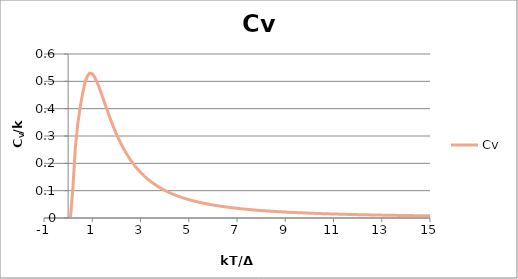
| Category | Cv |
|---|---|
| 0.1 | 0.003 |
| 0.2 | 0.111 |
| 0.3 | 0.258 |
| 0.4 | 0.345 |
| 0.5 | 0.405 |
| 0.6 | 0.456 |
| 0.7 | 0.495 |
| 0.8 | 0.52 |
| 0.9 | 0.53 |
| 1.0 | 0.528 |
| 1.1 | 0.516 |
| 1.2 | 0.497 |
| 1.3 | 0.475 |
| 1.4 | 0.45 |
| 1.5 | 0.424 |
| 1.6 | 0.399 |
| 1.7 | 0.374 |
| 1.8 | 0.351 |
| 1.9 | 0.328 |
| 2.0 | 0.308 |
| 2.1 | 0.288 |
| 2.2 | 0.27 |
| 2.3 | 0.253 |
| 2.4 | 0.238 |
| 2.5 | 0.224 |
| 2.6 | 0.211 |
| 2.7 | 0.198 |
| 2.8 | 0.187 |
| 2.9 | 0.177 |
| 3.0 | 0.167 |
| 3.1 | 0.158 |
| 3.2 | 0.15 |
| 3.3 | 0.142 |
| 3.4 | 0.135 |
| 3.5 | 0.129 |
| 3.6 | 0.122 |
| 3.7 | 0.117 |
| 3.8 | 0.111 |
| 3.9 | 0.106 |
| 4.0 | 0.101 |
| 4.1 | 0.097 |
| 4.2 | 0.093 |
| 4.3 | 0.089 |
| 4.4 | 0.085 |
| 4.5 | 0.082 |
| 4.6 | 0.079 |
| 4.7 | 0.076 |
| 4.8 | 0.073 |
| 4.9 | 0.07 |
| 5.0 | 0.067 |
| 5.1 | 0.065 |
| 5.2 | 0.063 |
| 5.3 | 0.06 |
| 5.4 | 0.058 |
| 5.5 | 0.056 |
| 5.6 | 0.054 |
| 5.7 | 0.053 |
| 5.8 | 0.051 |
| 5.9 | 0.049 |
| 6.0 | 0.048 |
| 6.1 | 0.046 |
| 6.2 | 0.045 |
| 6.3 | 0.043 |
| 6.4 | 0.042 |
| 6.5 | 0.041 |
| 6.6 | 0.04 |
| 6.7 | 0.039 |
| 6.8 | 0.038 |
| 6.9 | 0.036 |
| 7.0 | 0.035 |
| 7.1 | 0.035 |
| 7.2 | 0.034 |
| 7.3 | 0.033 |
| 7.4 | 0.032 |
| 7.5 | 0.031 |
| 7.6 | 0.03 |
| 7.7 | 0.029 |
| 7.8 | 0.029 |
| 7.9 | 0.028 |
| 8.0 | 0.027 |
| 8.1 | 0.027 |
| 8.2 | 0.026 |
| 8.3 | 0.025 |
| 8.4 | 0.025 |
| 8.5 | 0.024 |
| 8.6 | 0.024 |
| 8.7 | 0.023 |
| 8.8 | 0.023 |
| 8.9 | 0.022 |
| 9.0 | 0.022 |
| 9.1 | 0.021 |
| 9.2 | 0.021 |
| 9.3 | 0.02 |
| 9.4 | 0.02 |
| 9.5 | 0.02 |
| 9.6 | 0.019 |
| 9.7 | 0.019 |
| 9.8 | 0.018 |
| 9.9 | 0.018 |
| 10.0 | 0.018 |
| 10.1 | 0.017 |
| 10.2 | 0.017 |
| 10.3 | 0.017 |
| 10.4 | 0.016 |
| 10.5 | 0.016 |
| 10.6 | 0.016 |
| 10.7 | 0.015 |
| 10.8 | 0.015 |
| 10.9 | 0.015 |
| 11.0 | 0.015 |
| 11.1 | 0.014 |
| 11.2 | 0.014 |
| 11.3 | 0.014 |
| 11.4 | 0.014 |
| 11.5 | 0.013 |
| 11.6 | 0.013 |
| 11.7 | 0.013 |
| 11.8 | 0.013 |
| 11.9 | 0.013 |
| 12.0 | 0.012 |
| 12.1 | 0.012 |
| 12.2 | 0.012 |
| 12.3 | 0.012 |
| 12.4 | 0.012 |
| 12.5 | 0.011 |
| 12.6 | 0.011 |
| 12.7 | 0.011 |
| 12.8 | 0.011 |
| 12.9 | 0.011 |
| 13.0 | 0.011 |
| 13.1 | 0.01 |
| 13.2 | 0.01 |
| 13.3 | 0.01 |
| 13.4 | 0.01 |
| 13.5 | 0.01 |
| 13.6 | 0.01 |
| 13.7 | 0.01 |
| 13.8 | 0.009 |
| 13.9 | 0.009 |
| 14.0 | 0.009 |
| 14.1 | 0.009 |
| 14.2 | 0.009 |
| 14.3 | 0.009 |
| 14.4 | 0.009 |
| 14.5 | 0.008 |
| 14.6 | 0.008 |
| 14.7 | 0.008 |
| 14.8 | 0.008 |
| 14.9 | 0.008 |
| 15.0 | 0.008 |